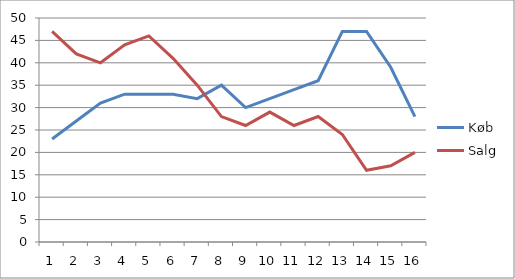
| Category | Køb | Salg |
|---|---|---|
| 0 | 23 | 47 |
| 1 | 27 | 42 |
| 2 | 31 | 40 |
| 3 | 33 | 44 |
| 4 | 33 | 46 |
| 5 | 33 | 41 |
| 6 | 32 | 35 |
| 7 | 35 | 28 |
| 8 | 30 | 26 |
| 9 | 32 | 29 |
| 10 | 34 | 26 |
| 11 | 36 | 28 |
| 12 | 47 | 24 |
| 13 | 47 | 16 |
| 14 | 39 | 17 |
| 15 | 28 | 20 |